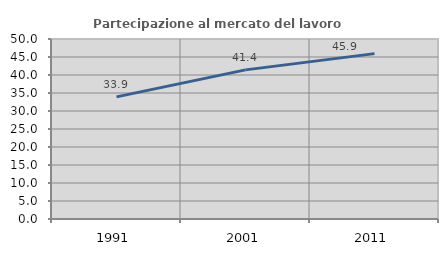
| Category | Partecipazione al mercato del lavoro  femminile |
|---|---|
| 1991.0 | 33.922 |
| 2001.0 | 41.424 |
| 2011.0 | 45.938 |